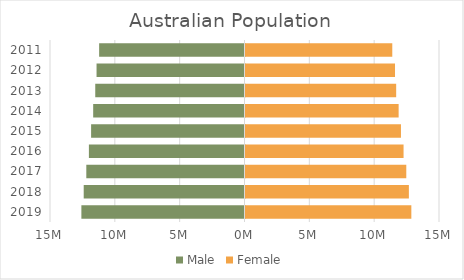
| Category | Male | Female |
|---|---|---|
| 2011.0 | -11210000 | 11320000 |
| 2012.0 | -11410000 | 11530000 |
| 2013.0 | -11510000 | 11620000 |
| 2014.0 | -11670000 | 11810000 |
| 2015.0 | -11830000 | 11990000 |
| 2016.0 | -12000000 | 12190000 |
| 2017.0 | -12200000 | 12400000 |
| 2018.0 | -12400000 | 12600000 |
| 2019.0 | -12580000 | 12790000 |